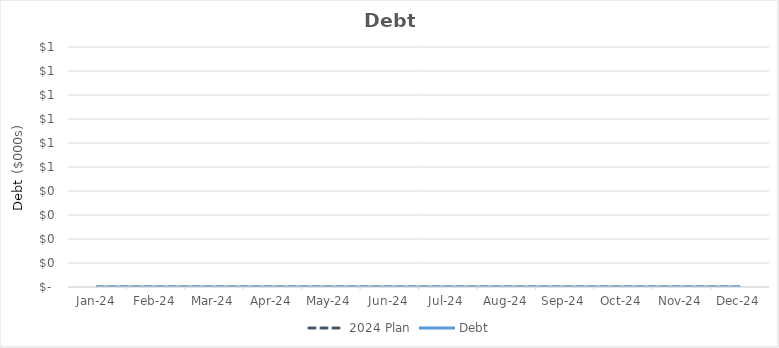
| Category | 2024 Plan | Debt |
|---|---|---|
| 2024-01-31 | 0 | 0 |
| 2024-02-29 | 0 | 0 |
| 2024-03-31 | 0 | 0 |
| 2024-04-30 | 0 | 0 |
| 2024-05-31 | 0 | 0 |
| 2024-06-30 | 0 | 0 |
| 2024-07-31 | 0 | 0 |
| 2024-08-31 | 0 | 0 |
| 2024-09-30 | 0 | 0 |
| 2024-10-31 | 0 | 0 |
| 2024-11-30 | 0 | 0 |
| 2024-12-31 | 0 | 0 |